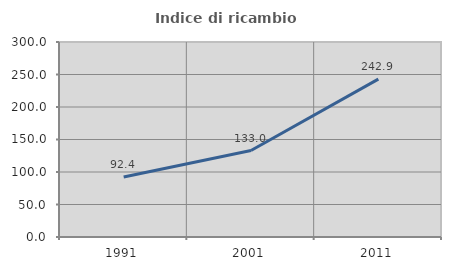
| Category | Indice di ricambio occupazionale  |
|---|---|
| 1991.0 | 92.353 |
| 2001.0 | 133.043 |
| 2011.0 | 242.857 |